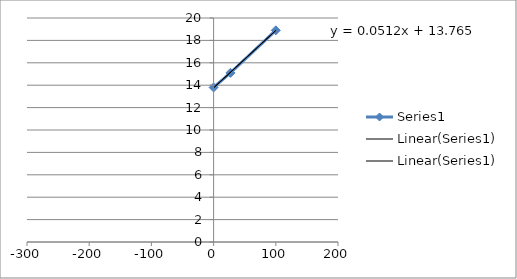
| Category | Series 0 |
|---|---|
| 0.0 | 13.8 |
| 27.0 | 15.1 |
| 100.0 | 18.9 |